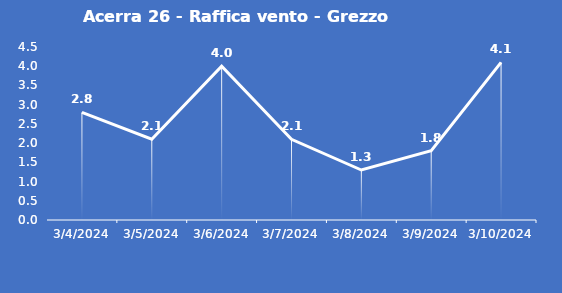
| Category | Acerra 26 - Raffica vento - Grezzo (m/s) |
|---|---|
| 3/4/24 | 2.8 |
| 3/5/24 | 2.1 |
| 3/6/24 | 4 |
| 3/7/24 | 2.1 |
| 3/8/24 | 1.3 |
| 3/9/24 | 1.8 |
| 3/10/24 | 4.1 |